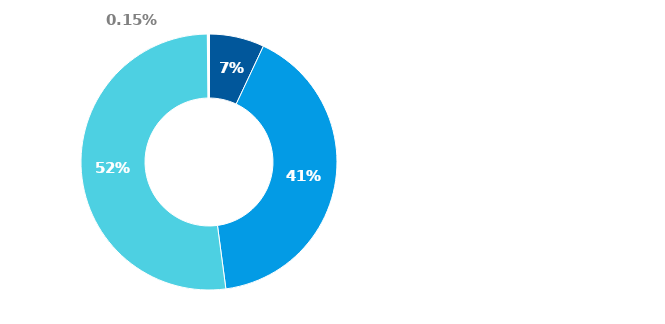
| Category | Series 0 |
|---|---|
| Hotovost | 0.07 |
| Půjčky poskytnuté nemovitostní společnosti | 0.409 |
| Majetkové účasti v nemovitostní společnosti | 0.52 |
| Ostatní finanční aktiva | 0.002 |